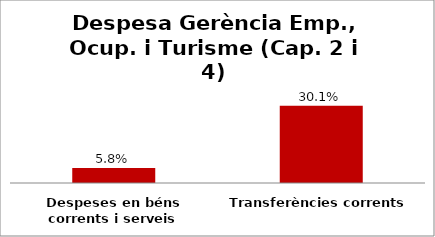
| Category | Series 0 |
|---|---|
| Despeses en béns corrents i serveis | 0.058 |
| Transferències corrents | 0.301 |